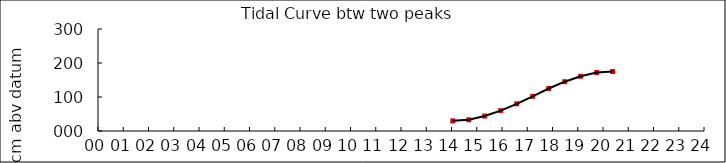
| Category | Height cm |
|---|---|
| 14.05 | 29.787 |
| 14.68333333333333 | 33 |
| 15.31666666666667 | 44 |
| 15.95 | 60 |
| 16.58333333333333 | 80 |
| 17.21666666666666 | 102 |
| 17.85 | 125 |
| 18.48333333333333 | 145 |
| 19.11666666666667 | 161 |
| 19.75 | 172 |
| 20.38333333333333 | 175 |